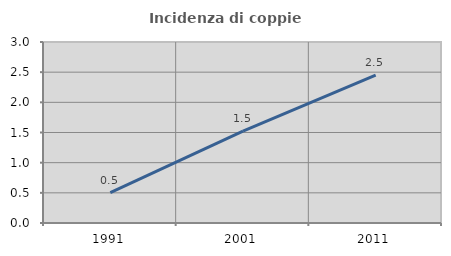
| Category | Incidenza di coppie miste |
|---|---|
| 1991.0 | 0.503 |
| 2001.0 | 1.521 |
| 2011.0 | 2.45 |